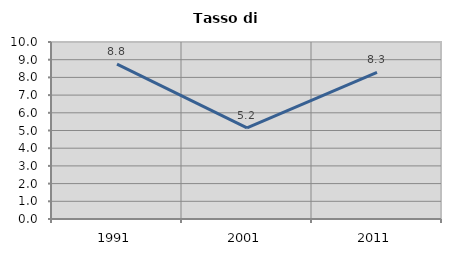
| Category | Tasso di disoccupazione   |
|---|---|
| 1991.0 | 8.751 |
| 2001.0 | 5.153 |
| 2011.0 | 8.277 |